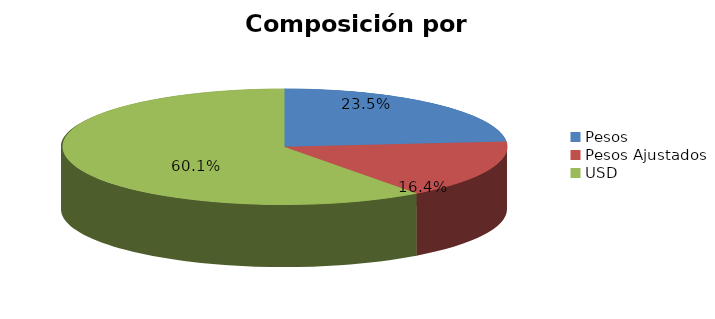
| Category | % | Millones ARS |
|---|---|---|
| Pesos | 0.235 | 17194.883 |
| Pesos Ajustados | 0.164 | 11950.109 |
| USD | 0.601 | 43928.394 |